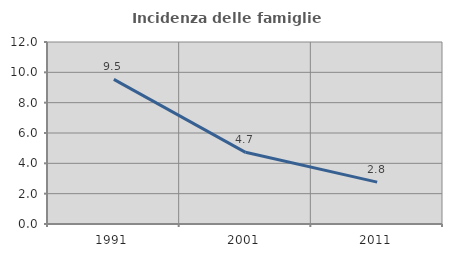
| Category | Incidenza delle famiglie numerose |
|---|---|
| 1991.0 | 9.534 |
| 2001.0 | 4.725 |
| 2011.0 | 2.761 |